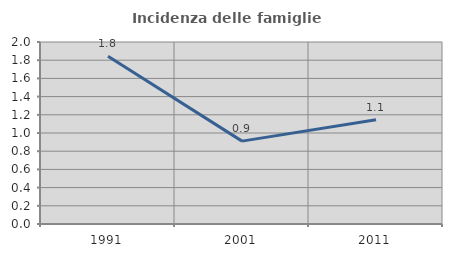
| Category | Incidenza delle famiglie numerose |
|---|---|
| 1991.0 | 1.843 |
| 2001.0 | 0.911 |
| 2011.0 | 1.145 |